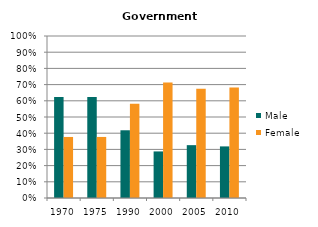
| Category | Male | Female |
|---|---|---|
| 1970.0 | 0.623 | 0.377 |
| 1975.0 | 0.623 | 0.377 |
| 1990.0 | 0.418 | 0.582 |
| 2000.0 | 0.287 | 0.713 |
| 2005.0 | 0.326 | 0.674 |
| 2010.0 | 0.318 | 0.682 |